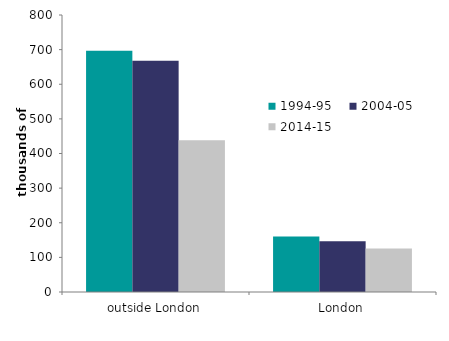
| Category | 1994-95 | 2004-05 | 2014-15 |
|---|---|---|---|
| outside London | 696.475 | 668.073 | 438.115 |
| London | 160.176 | 146.815 | 125.529 |